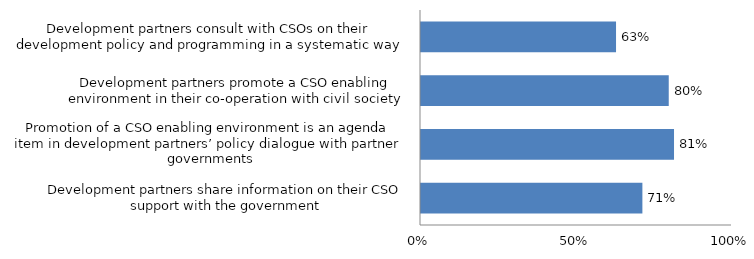
| Category | Series 0 |
|---|---|
| Development partners share information on their CSO support with the government | 0.712 |
| Promotion of a CSO enabling environment is an agenda item in development partners’ policy dialogue with partner governments | 0.814 |
| Development partners promote a CSO enabling environment in their co-operation with civil society | 0.797 |
| Development partners consult with CSOs on their development policy and programming in a systematic way | 0.627 |